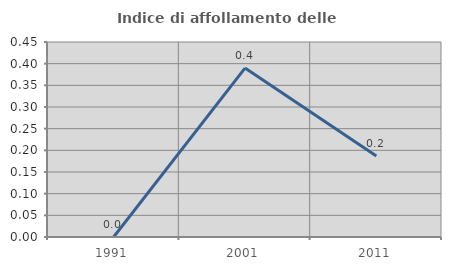
| Category | Indice di affollamento delle abitazioni  |
|---|---|
| 1991.0 | 0 |
| 2001.0 | 0.39 |
| 2011.0 | 0.187 |